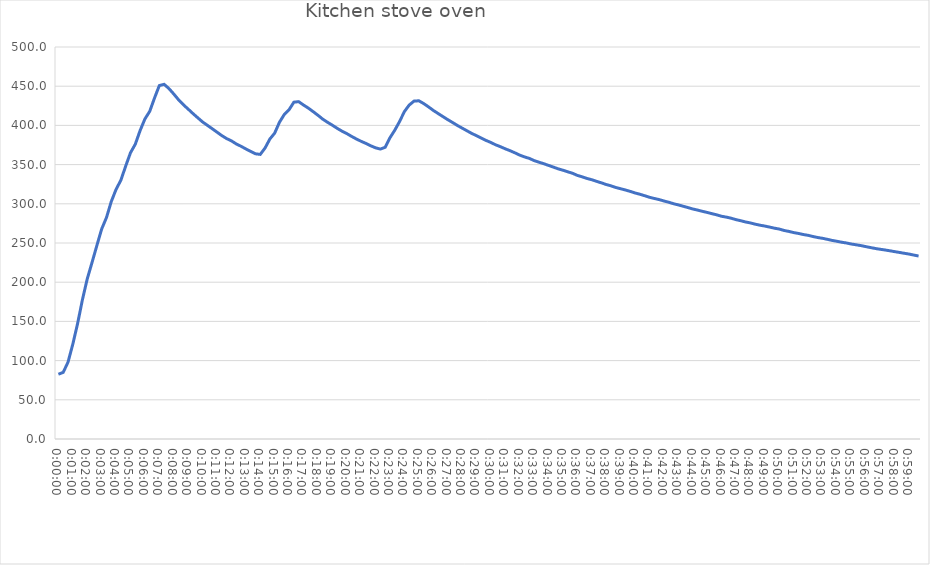
| Category | Value |
|---|---|
| 0.0 | 82.6 |
| 0.00023148148148155467 | 85 |
| 0.00046296296296310935 | 98 |
| 0.000694444444444553 | 121 |
| 0.0009259259259259967 | 147.4 |
| 0.0011574074074074403 | 177.7 |
| 0.001388888888888995 | 204.2 |
| 0.0016203703703705497 | 225.2 |
| 0.0018518518518518823 | 246.7 |
| 0.002083333333333437 | 267.8 |
| 0.0023148148148148806 | 282.4 |
| 0.0025462962962964353 | 302.8 |
| 0.002777777777777768 | 318.4 |
| 0.0030092592592593226 | 330.1 |
| 0.0032407407407408773 | 348.1 |
| 0.003472222222222321 | 365.1 |
| 0.0037037037037038756 | 376 |
| 0.003935185185185208 | 393.4 |
| 0.004166666666666763 | 408.2 |
| 0.0043981481481483176 | 417.9 |
| 0.004629629629629761 | 434.9 |
| 0.004861111111111205 | 450.8 |
| 0.0050925925925926485 | 452.4 |
| 0.005324074074074203 | 447 |
| 0.005555555555555758 | 440.1 |
| 0.0057870370370370905 | 432.7 |
| 0.006018518518518645 | 426.4 |
| 0.006250000000000089 | 420.8 |
| 0.0064814814814816435 | 415.1 |
| 0.006712962962962976 | 409.7 |
| 0.006944444444444531 | 404.4 |
| 0.0071759259259260855 | 400.1 |
| 0.007407407407407529 | 395.8 |
| 0.007638888888888973 | 391.4 |
| 0.007870370370370416 | 387 |
| 0.008101851851851971 | 383.2 |
| 0.008333333333333526 | 380.3 |
| 0.008564814814814858 | 376.4 |
| 0.008796296296296413 | 373.4 |
| 0.009027777777777857 | 370 |
| 0.009259259259259411 | 366.9 |
| 0.009490740740740744 | 363.8 |
| 0.009722222222222299 | 363 |
| 0.009953703703703853 | 371.1 |
| 0.010185185185185297 | 382.6 |
| 0.01041666666666674 | 390.1 |
| 0.010648148148148184 | 404 |
| 0.010879629629629739 | 413.9 |
| 0.011111111111111294 | 420 |
| 0.011342592592592626 | 429.6 |
| 0.011574074074074181 | 430.3 |
| 0.011805555555555625 | 426 |
| 0.01203703703703718 | 422.1 |
| 0.012268518518518512 | 417.6 |
| 0.012500000000000067 | 413 |
| 0.012731481481481621 | 408 |
| 0.012962962962963065 | 404 |
| 0.013194444444444509 | 400.3 |
| 0.013425925925925952 | 396.3 |
| 0.013657407407407507 | 392.7 |
| 0.013888888888889062 | 389.6 |
| 0.014120370370370505 | 386 |
| 0.014351851851851949 | 382.7 |
| 0.014583333333333393 | 379.7 |
| 0.014814814814814947 | 377 |
| 0.015046296296296502 | 374 |
| 0.015277777777777835 | 371.4 |
| 0.01550925925925939 | 369.8 |
| 0.015740740740740833 | 372.1 |
| 0.015972222222222388 | 384.3 |
| 0.01620370370370372 | 393.9 |
| 0.016435185185185275 | 405 |
| 0.01666666666666683 | 417.7 |
| 0.016898148148148273 | 425.9 |
| 0.017129629629629717 | 431 |
| 0.01736111111111116 | 431.4 |
| 0.017592592592592715 | 427.9 |
| 0.01782407407407427 | 423.7 |
| 0.018055555555555602 | 419.2 |
| 0.018287037037037157 | 415.2 |
| 0.0185185185185186 | 411.3 |
| 0.018750000000000155 | 407.4 |
| 0.018981481481481488 | 403.8 |
| 0.019212962962963043 | 400 |
| 0.019444444444444597 | 396.6 |
| 0.01967592592592604 | 393.2 |
| 0.019907407407407485 | 389.8 |
| 0.02013888888888893 | 386.9 |
| 0.020370370370370483 | 383.8 |
| 0.020601851851852038 | 380.8 |
| 0.02083333333333337 | 378.2 |
| 0.021064814814814925 | 375.2 |
| 0.02129629629629637 | 372.8 |
| 0.021527777777777923 | 370.1 |
| 0.021759259259259256 | 367.7 |
| 0.02199074074074081 | 365 |
| 0.022222222222222365 | 362.1 |
| 0.02245370370370381 | 359.8 |
| 0.022685185185185253 | 357.9 |
| 0.022916666666666696 | 355.1 |
| 0.02314814814814825 | 353.1 |
| 0.023379629629629806 | 351.1 |
| 0.023611111111111138 | 349 |
| 0.023842592592592693 | 346.8 |
| 0.024074074074074137 | 344.6 |
| 0.02430555555555569 | 342.8 |
| 0.024537037037037246 | 340.8 |
| 0.02476851851851858 | 338.9 |
| 0.025000000000000133 | 336.2 |
| 0.025231481481481577 | 334.4 |
| 0.02546296296296313 | 332.3 |
| 0.025694444444444464 | 330.7 |
| 0.02592592592592602 | 328.6 |
| 0.026157407407407574 | 326.7 |
| 0.026388888888889017 | 324.6 |
| 0.02662037037037046 | 322.9 |
| 0.026851851851851904 | 320.8 |
| 0.02708333333333346 | 319.2 |
| 0.027314814814815014 | 317.6 |
| 0.027546296296296346 | 315.8 |
| 0.0277777777777779 | 313.8 |
| 0.028009259259259345 | 312.2 |
| 0.0282407407407409 | 310.3 |
| 0.028472222222222232 | 308.3 |
| 0.028703703703703787 | 306.8 |
| 0.02893518518518534 | 305.4 |
| 0.029166666666666785 | 303.6 |
| 0.02939814814814823 | 302 |
| 0.029629629629629672 | 300.1 |
| 0.029861111111111227 | 298.6 |
| 0.030092592592592782 | 296.9 |
| 0.030324074074074114 | 295.2 |
| 0.03055555555555567 | 293.4 |
| 0.030787037037037113 | 292 |
| 0.031018518518518667 | 290.4 |
| 0.03125 | 289 |
| 0.031481481481481555 | 287.4 |
| 0.03171296296296311 | 285.9 |
| 0.03194444444444455 | 284.1 |
| 0.032175925925926 | 283 |
| 0.03240740740740744 | 281.6 |
| 0.032638888888888995 | 279.8 |
| 0.03287037037037055 | 278.4 |
| 0.03310185185185188 | 276.8 |
| 0.03333333333333344 | 275.6 |
| 0.03356481481481488 | 274 |
| 0.033796296296296435 | 272.7 |
| 0.03402777777777777 | 271.6 |
| 0.03425925925925932 | 270.3 |
| 0.03449074074074088 | 268.9 |
| 0.03472222222222232 | 267.8 |
| 0.034953703703703876 | 266 |
| 0.03518518518518521 | 264.8 |
| 0.03541666666666676 | 263.3 |
| 0.03564814814814832 | 262.2 |
| 0.03587962962962976 | 260.8 |
| 0.036111111111111205 | 259.8 |
| 0.03634259259259265 | 258.3 |
| 0.0365740740740742 | 257 |
| 0.03680555555555576 | 256 |
| 0.03703703703703709 | 254.7 |
| 0.037268518518518645 | 253.3 |
| 0.03750000000000009 | 252.2 |
| 0.037731481481481643 | 251 |
| 0.037962962962962976 | 250 |
| 0.03819444444444453 | 248.7 |
| 0.038425925925926085 | 247.7 |
| 0.03865740740740753 | 246.7 |
| 0.03888888888888897 | 245.4 |
| 0.039120370370370416 | 244.2 |
| 0.03935185185185197 | 243 |
| 0.039583333333333526 | 242 |
| 0.03981481481481486 | 241.1 |
| 0.04004629629629641 | 240.1 |
| 0.04027777777777786 | 239 |
| 0.04050925925925941 | 238 |
| 0.040740740740740744 | 236.9 |
| 0.0409722222222223 | 235.9 |
| 0.04120370370370385 | 234.6 |
| 0.0414351851851853 | 233.4 |